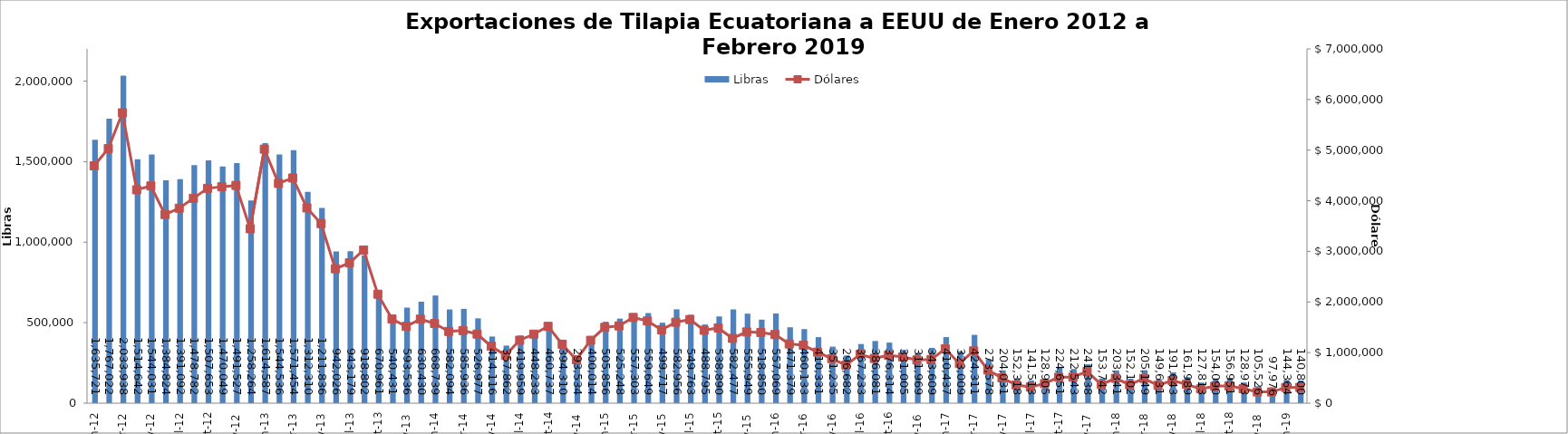
| Category | Libras  |
|---|---|
| 2012-01-01 | 1635720.607 |
| 2012-02-01 | 1767022.174 |
| 2012-03-01 | 2033937.505 |
| 2012-04-01 | 1514641.77 |
| 2012-05-01 | 1544031.293 |
| 2012-06-01 | 1384823.899 |
| 2012-07-01 | 1391091.577 |
| 2012-08-01 | 1478781.747 |
| 2012-09-01 | 1507653.188 |
| 2012-10-01 | 1470049.326 |
| 2012-11-01 | 1491526.539 |
| 2012-12-01 | 1258264 |
| 2013-01-01 | 1614587 |
| 2013-02-01 | 1544536.146 |
| 2013-03-01 | 1571454.312 |
| 2013-04-01 | 1312310.196 |
| 2013-05-01 | 1211835.551 |
| 2013-06-01 | 942025.58 |
| 2013-07-01 | 943178.586 |
| 2013-08-01 | 918802.324 |
| 2013-09-01 | 670961.192 |
| 2013-10-01 | 540431.235 |
| 2013-11-01 | 593535.64 |
| 2013-12-01 | 630429.621 |
| 2014-01-01 | 668739 |
| 2014-02-01 | 582093.766 |
| 2014-03-01 | 585936.383 |
| 2014-04-01 | 526976.561 |
| 2014-05-01 | 414116.473 |
| 2014-06-01 | 357861.695 |
| 2014-07-01 | 419958.663 |
| 2014-08-01 | 448233 |
| 2014-09-01 | 460737.149 |
| 2014-10-01 | 394310.347 |
| 2014-11-01 | 293533.672 |
| 2014-12-01 | 400013.647 |
| 2015-01-01 | 505856.493 |
| 2015-02-01 | 525248 |
| 2015-03-01 | 557303.039 |
| 2015-04-01 | 559648.733 |
| 2015-05-01 | 499716.682 |
| 2015-06-01 | 582955.764 |
| 2015-07-01 | 549763.307 |
| 2015-08-01 | 488795.094 |
| 2015-09-01 | 538890.219 |
| 2015-10-01 | 582477.366 |
| 2015-11-01 | 555949.414 |
| 2015-12-01 | 518850.405 |
| 2016-01-01 | 557069.351 |
| 2016-02-01 | 471378.754 |
| 2016-03-01 | 460133.089 |
| 2016-04-01 | 410331.175 |
| 2016-05-01 | 351235 |
| 2016-06-01 | 296682 |
| 2016-07-01 | 367233.45 |
| 2016-08-01 | 386080.575 |
| 2016-09-01 | 376314.197 |
| 2016-10-01 | 331005.258 |
| 2016-11-01 | 311968.537 |
| 2016-12-01 | 343608.956 |
| 2017-01-01 | 410436.996 |
| 2017-02-01 | 323009.174 |
| 2017-03-01 | 424310.544 |
| 2017-04-01 | 273577.632 |
| 2017-05-01 | 204031.321 |
| 2017-06-01 | 152318.019 |
| 2017-07-01 | 141513.274 |
| 2017-08-01 | 128905.167 |
| 2017-09-01 | 224650.945 |
| 2017-10-01 | 212543.281 |
| 2017-11-01 | 241337.562 |
| 2017-12-01 | 153742.19 |
| 2018-01-01 | 203341.281 |
| 2018-02-01 | 152101.968 |
| 2018-03-01 | 205149.053 |
| 2018-04-01 | 149630.611 |
| 2018-05-01 | 191643 |
| 2018-06-01 | 161989 |
| 2018-07-01 | 127813 |
| 2018-08-01 | 154089.894 |
| 2018-09-01 | 156951.494 |
| 2018-10-01 | 128972.628 |
| 2018-11-01 | 105526.466 |
| 2018-12-01 | 97975.634 |
| 2019-01-01 | 144364.157 |
| 2019-02-01 | 140800 |